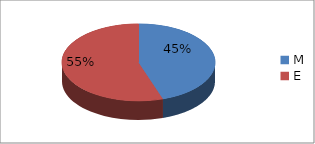
| Category | Series 0 |
|---|---|
| M | 35 |
| E | 43 |